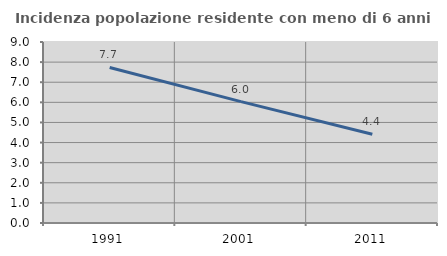
| Category | Incidenza popolazione residente con meno di 6 anni |
|---|---|
| 1991.0 | 7.733 |
| 2001.0 | 6.036 |
| 2011.0 | 4.41 |